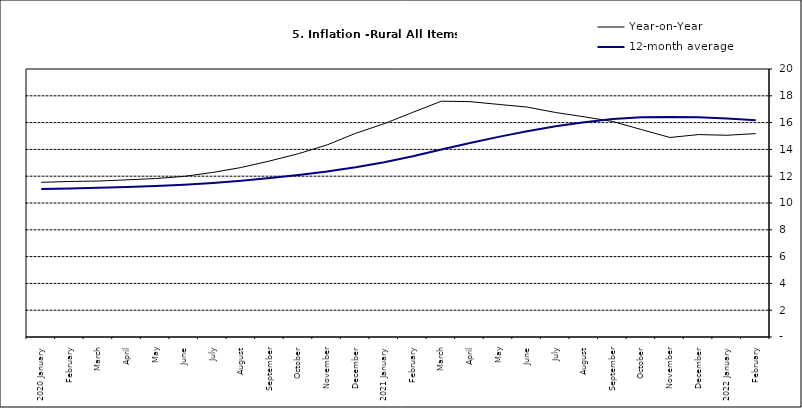
| Category | Year-on-Year | 12-month average |
|---|---|---|
| 2020 January | 11.543 | 11.037 |
| February | 11.606 | 11.086 |
| March | 11.639 | 11.141 |
| April | 11.728 | 11.197 |
| May | 11.826 | 11.261 |
| June | 11.988 | 11.355 |
| July | 12.28 | 11.493 |
| August | 12.651 | 11.664 |
| September | 13.14 | 11.864 |
| October | 13.68 | 12.086 |
| November | 14.335 | 12.346 |
| December | 15.2 | 12.67 |
| 2021 January | 15.918 | 13.043 |
| February | 16.766 | 13.482 |
| March | 17.596 | 13.985 |
| April | 17.566 | 14.475 |
| May | 17.358 | 14.935 |
| June | 17.159 | 15.362 |
| July | 16.753 | 15.726 |
| August | 16.433 | 16.03 |
| September | 16.081 | 16.26 |
| October | 15.48 | 16.393 |
| November | 14.89 | 16.419 |
| December | 15.106 | 16.397 |
| 2022 January | 15.055 | 16.313 |
| February | 15.179 | 16.176 |